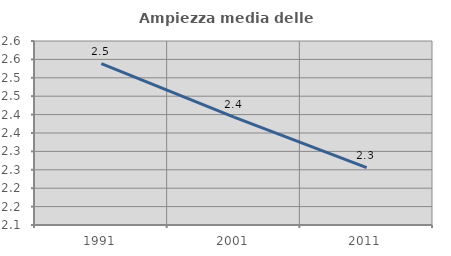
| Category | Ampiezza media delle famiglie |
|---|---|
| 1991.0 | 2.538 |
| 2001.0 | 2.393 |
| 2011.0 | 2.256 |